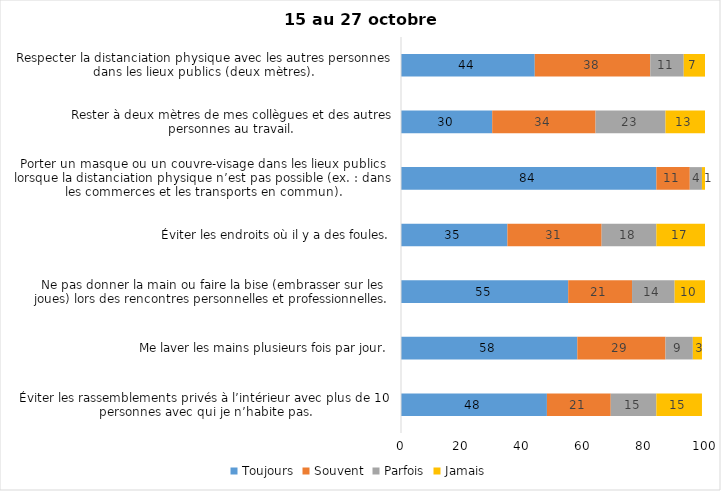
| Category | Toujours | Souvent | Parfois | Jamais |
|---|---|---|---|---|
| Éviter les rassemblements privés à l’intérieur avec plus de 10 personnes avec qui je n’habite pas. | 48 | 21 | 15 | 15 |
| Me laver les mains plusieurs fois par jour. | 58 | 29 | 9 | 3 |
| Ne pas donner la main ou faire la bise (embrasser sur les joues) lors des rencontres personnelles et professionnelles. | 55 | 21 | 14 | 10 |
| Éviter les endroits où il y a des foules. | 35 | 31 | 18 | 17 |
| Porter un masque ou un couvre-visage dans les lieux publics lorsque la distanciation physique n’est pas possible (ex. : dans les commerces et les transports en commun). | 84 | 11 | 4 | 1 |
| Rester à deux mètres de mes collègues et des autres personnes au travail. | 30 | 34 | 23 | 13 |
| Respecter la distanciation physique avec les autres personnes dans les lieux publics (deux mètres). | 44 | 38 | 11 | 7 |